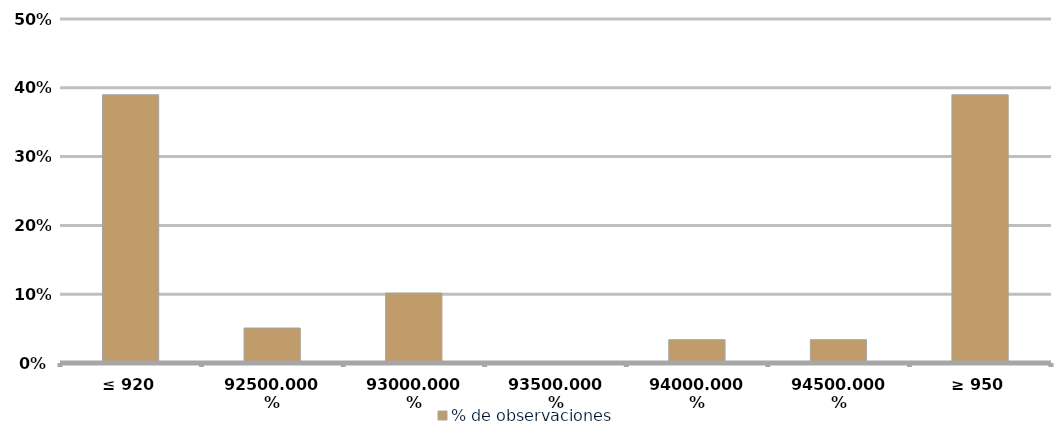
| Category | % de observaciones  |
|---|---|
| ≤ 920 | 0.39 |
| 925 | 0.051 |
| 930 | 0.102 |
| 935 | 0 |
| 940 | 0.034 |
| 945 | 0.034 |
| ≥ 950 | 0.39 |